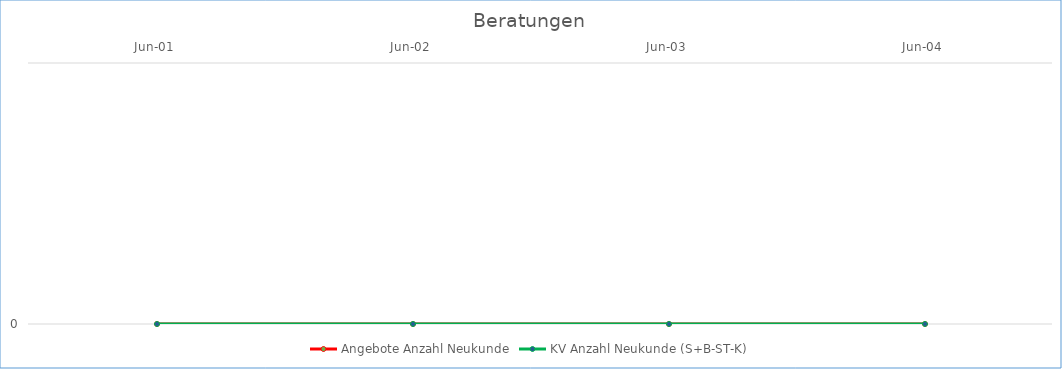
| Category | Angebote Anzahl Neukunde | KV Anzahl Neukunde (S+B-ST-K) |
|---|---|---|
| 2001-06-01 | 0 | 0 |
| 2002-06-01 | 0 | 0 |
| 2003-06-01 | 0 | 0 |
| 2004-06-01 | 0 | 0 |